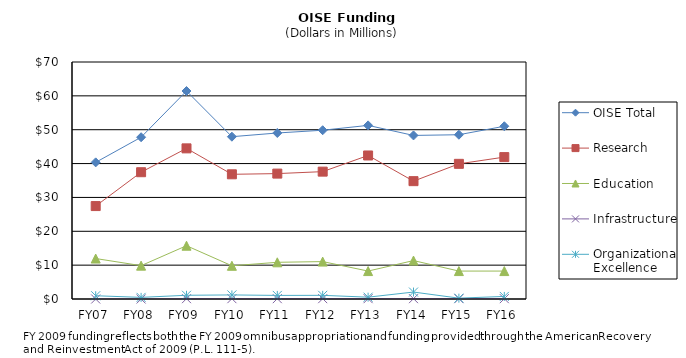
| Category | OISE Total | Research | Education | Infrastructure | Organizational Excellence |
|---|---|---|---|---|---|
| FY07 | 40.357 | 27.446 | 11.95 | 0 | 0.961 |
| FY08 | 47.78 | 37.45 | 9.85 | 0 | 0.48 |
| FY09 | 61.43 | 44.49 | 15.74 | 0.1 | 1.1 |
| FY10 | 47.94 | 36.83 | 9.81 | 0.1 | 1.2 |
| FY11 | 49.031 | 37.035 | 10.836 | 0.1 | 1.06 |
| FY12 | 49.85 | 37.62 | 11.05 | 0.1 | 1.08 |
| FY13 | 51.28 | 42.39 | 8.25 | 0.1 | 0.54 |
| FY14 | 48.31 | 34.81 | 11.35 | 0.1 | 2.05 |
| FY15 | 48.52 | 39.92 | 8.25 | 0.1 | 0.25 |
| FY16 | 51.02 | 41.91 | 8.25 | 0.1 | 0.76 |